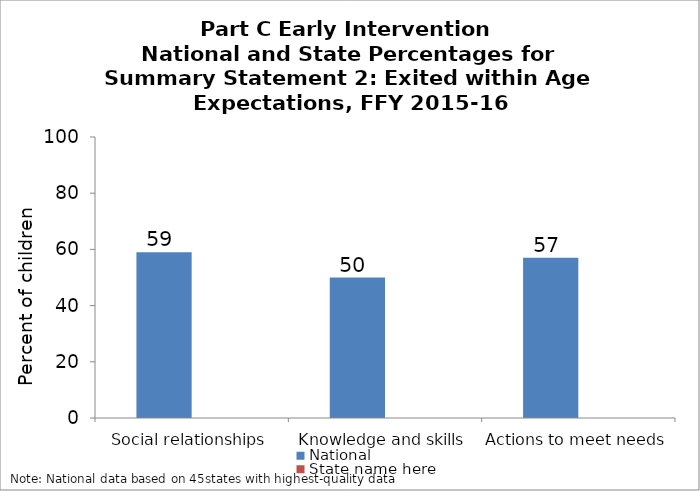
| Category | National | State name here |
|---|---|---|
| Social relationships | 59 |  |
| Knowledge and skills | 50 |  |
| Actions to meet needs | 57 |  |